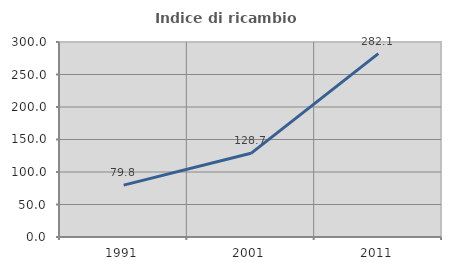
| Category | Indice di ricambio occupazionale  |
|---|---|
| 1991.0 | 79.832 |
| 2001.0 | 128.736 |
| 2011.0 | 282.143 |